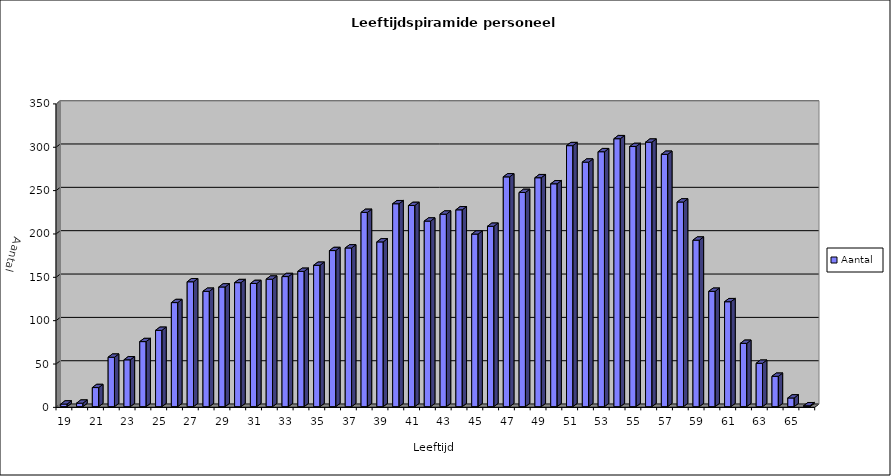
| Category | Aantal |
|---|---|
| 19.0 | 3 |
| 20.0 | 4 |
| 21.0 | 22 |
| 22.0 | 57 |
| 23.0 | 54 |
| 24.0 | 75 |
| 25.0 | 88 |
| 26.0 | 120 |
| 27.0 | 144 |
| 28.0 | 133 |
| 29.0 | 138 |
| 30.0 | 143 |
| 31.0 | 142 |
| 32.0 | 147 |
| 33.0 | 150 |
| 34.0 | 156 |
| 35.0 | 163 |
| 36.0 | 180 |
| 37.0 | 183 |
| 38.0 | 224 |
| 39.0 | 190 |
| 40.0 | 234 |
| 41.0 | 232 |
| 42.0 | 214 |
| 43.0 | 222 |
| 44.0 | 227 |
| 45.0 | 199 |
| 46.0 | 208 |
| 47.0 | 265 |
| 48.0 | 247 |
| 49.0 | 264 |
| 50.0 | 257 |
| 51.0 | 301 |
| 52.0 | 282 |
| 53.0 | 294 |
| 54.0 | 309 |
| 55.0 | 300 |
| 56.0 | 305 |
| 57.0 | 291 |
| 58.0 | 236 |
| 59.0 | 192 |
| 60.0 | 133 |
| 61.0 | 121 |
| 62.0 | 73 |
| 63.0 | 50 |
| 64.0 | 35 |
| 65.0 | 10 |
| 66.0 | 1 |